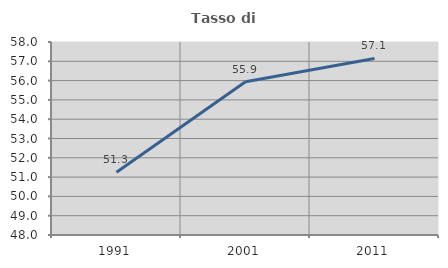
| Category | Tasso di occupazione   |
|---|---|
| 1991.0 | 51.256 |
| 2001.0 | 55.937 |
| 2011.0 | 57.15 |